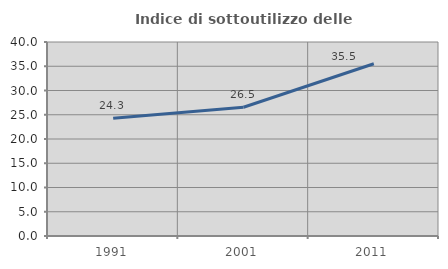
| Category | Indice di sottoutilizzo delle abitazioni  |
|---|---|
| 1991.0 | 24.282 |
| 2001.0 | 26.546 |
| 2011.0 | 35.518 |